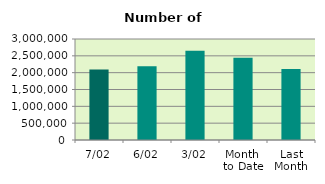
| Category | Series 0 |
|---|---|
| 7/02 | 2094574 |
| 6/02 | 2191122 |
| 3/02 | 2653308 |
| Month 
to Date | 2440052.8 |
| Last
Month | 2107310.455 |